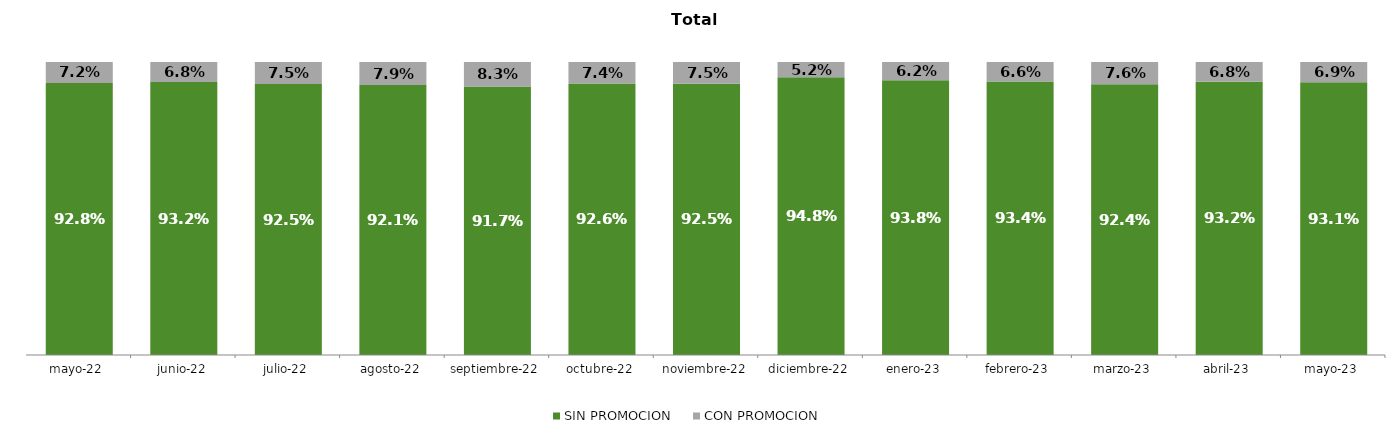
| Category | SIN PROMOCION   | CON PROMOCION   |
|---|---|---|
| 2022-05-01 | 0.928 | 0.072 |
| 2022-06-01 | 0.932 | 0.068 |
| 2022-07-01 | 0.925 | 0.075 |
| 2022-08-01 | 0.921 | 0.079 |
| 2022-09-01 | 0.917 | 0.083 |
| 2022-10-01 | 0.926 | 0.074 |
| 2022-11-01 | 0.925 | 0.075 |
| 2022-12-01 | 0.948 | 0.052 |
| 2023-01-01 | 0.938 | 0.062 |
| 2023-02-01 | 0.934 | 0.066 |
| 2023-03-01 | 0.924 | 0.076 |
| 2023-04-01 | 0.932 | 0.068 |
| 2023-05-01 | 0.931 | 0.069 |